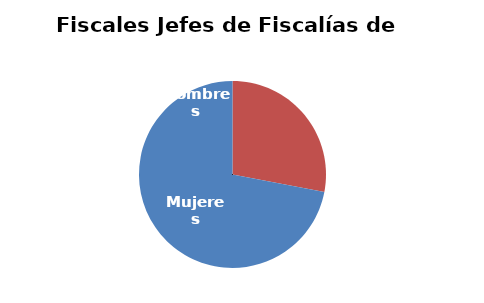
| Category | Fiscales Jefes de Fiscalías de Área  |
|---|---|
| Hombres | 7 |
| Mujeres | 18 |